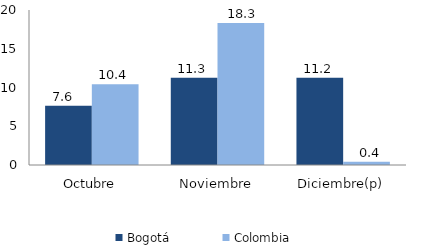
| Category | Bogotá | Colombia |
|---|---|---|
| Octubre | 7.639 | 10.421 |
| Noviembre | 11.256 | 18.33 |
| Diciembre(p) | 11.244 | 0.433 |